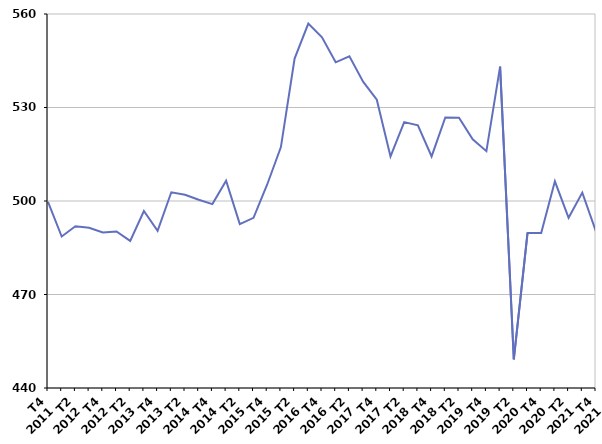
| Category | Ensemble des entrées en catégories A, B, C |
|---|---|
| T4
2011 | 499.7 |
| T1
2012 | 488.6 |
| T2
2012 | 491.9 |
| T3
2012 | 491.4 |
| T4
2012 | 489.9 |
| T1
2013 | 490.2 |
| T2
2013 | 487.2 |
| T3
2013 | 496.8 |
| T4
2013 | 490.4 |
| T1
2014 | 502.8 |
| T2
2014 | 502 |
| T3
2014 | 500.4 |
| T4
2014 | 499 |
| T1
2015 | 506.5 |
| T2
2015 | 492.6 |
| T3
2015 | 494.6 |
| T4
2015 | 505.3 |
| T1
2016 | 517.3 |
| T2
2016 | 545.7 |
| T3
2016 | 556.9 |
| T4
2016 | 552.5 |
| T1
2017 | 544.5 |
| T2
2017 | 546.4 |
| T3
2017 | 538.3 |
| T4
2017 | 532.5 |
| T1
2018 | 514.3 |
| T2
2018 | 525.3 |
| T3
2018 | 524.3 |
| T4
2018 | 514.3 |
| T1
2019 | 526.8 |
| T2
2019 | 526.7 |
| T3
2019 | 519.8 |
| T4
2019 | 516 |
| T1
2020 | 543.1 |
| T2
2020 | 449.2 |
| T3
2020 | 489.7 |
| T4
2020 | 489.7 |
| T1
2021 | 506.3 |
| T2
2021 | 494.6 |
| T3
2021 | 502.7 |
| T4
2021 | 490.2 |